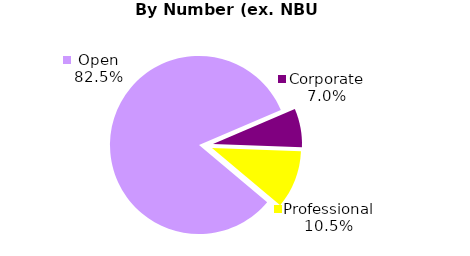
| Category | Series 0 |
|---|---|
| Open | 47 |
| Corporate | 4 |
| Professional | 6 |